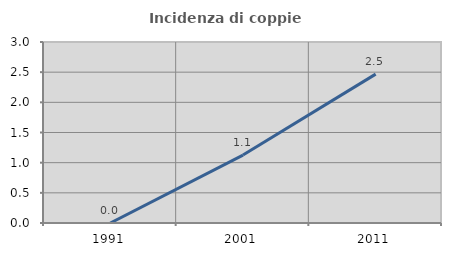
| Category | Incidenza di coppie miste |
|---|---|
| 1991.0 | 0 |
| 2001.0 | 1.126 |
| 2011.0 | 2.467 |